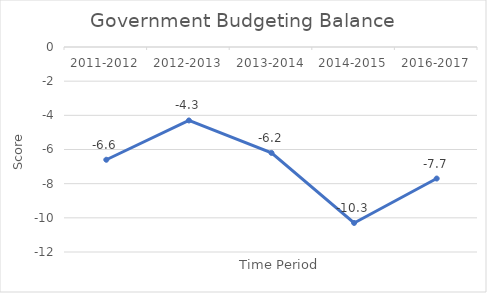
| Category | Series 0 |
|---|---|
| 2011-2012 | -6.6 |
| 2012-2013 | -4.3 |
| 2013-2014 | -6.2 |
| 2014-2015 | -10.3 |
| 2016-2017 | -7.7 |